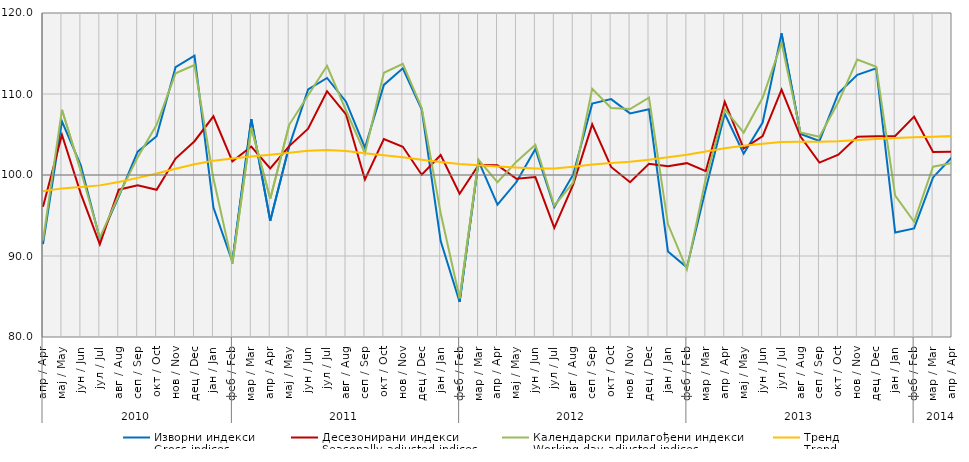
| Category | Изворни индекси
Gross indices | Десезонирани индекси
Seasonally adjusted indices | Календарски прилагођени индекси
Working-day adjusted indices | Тренд
Trend |
|---|---|---|---|---|
| 0 | 91.457 | 96.081 | 91.916 | 98.007 |
| 1 | 106.618 | 104.965 | 108.05 | 98.348 |
| 2 | 101.158 | 97.669 | 100.485 | 98.523 |
| 3 | 92.091 | 91.43 | 92.245 | 98.719 |
| 4 | 97.34 | 98.188 | 97.502 | 99.148 |
| 5 | 102.887 | 98.726 | 102.203 | 99.648 |
| 6 | 104.784 | 98.167 | 106.191 | 100.179 |
| 7 | 113.309 | 102.033 | 112.555 | 100.767 |
| 8 | 114.724 | 104.173 | 113.582 | 101.329 |
| 9 | 95.976 | 107.243 | 99.562 | 101.758 |
| 10 | 89.293 | 101.684 | 89.035 | 102.038 |
| 11 | 106.89 | 103.513 | 105.826 | 102.273 |
| 12 | 94.359 | 100.818 | 97.072 | 102.502 |
| 13 | 103.572 | 103.564 | 106.195 | 102.749 |
| 14 | 110.572 | 105.721 | 109.837 | 102.981 |
| 15 | 111.982 | 110.345 | 113.486 | 103.089 |
| 16 | 109.048 | 107.5 | 107.962 | 102.95 |
| 17 | 103.369 | 99.441 | 102.682 | 102.671 |
| 18 | 111.125 | 104.436 | 112.617 | 102.452 |
| 19 | 113.167 | 103.48 | 113.734 | 102.19 |
| 20 | 108.083 | 100.027 | 108.263 | 101.887 |
| 21 | 91.849 | 102.464 | 95.28 | 101.616 |
| 22 | 84.325 | 97.692 | 84.778 | 101.363 |
| 23 | 101.706 | 101.229 | 101.876 | 101.199 |
| 24 | 96.339 | 101.211 | 99.108 | 101.061 |
| 25 | 99.133 | 99.536 | 101.643 | 100.922 |
| 26 | 103.214 | 99.738 | 103.732 | 100.817 |
| 27 | 96.046 | 93.476 | 96.206 | 100.796 |
| 28 | 100.071 | 98.843 | 99.075 | 101.011 |
| 29 | 108.809 | 106.256 | 110.638 | 101.307 |
| 30 | 109.371 | 100.989 | 108.283 | 101.472 |
| 31 | 107.609 | 99.105 | 108.148 | 101.638 |
| 32 | 108.112 | 101.39 | 109.564 | 101.891 |
| 33 | 90.559 | 101.086 | 93.942 | 102.183 |
| 34 | 88.596 | 101.464 | 88.34 | 102.499 |
| 35 | 98.288 | 100.488 | 99.607 | 102.889 |
| 36 | 107.567 | 109.028 | 108.106 | 103.308 |
| 37 | 102.635 | 103.268 | 105.234 | 103.599 |
| 38 | 106.478 | 104.798 | 109.539 | 103.862 |
| 39 | 117.488 | 110.55 | 116.318 | 104.082 |
| 40 | 105.073 | 104.746 | 105.249 | 104.112 |
| 41 | 104.198 | 101.534 | 104.721 | 104.1 |
| 42 | 110.096 | 102.505 | 109 | 104.181 |
| 43 | 112.368 | 104.709 | 114.258 | 104.32 |
| 44 | 113.169 | 104.797 | 113.358 | 104.451 |
| 45 | 92.9 | 104.812 | 97.462 | 104.576 |
| 46 | 93.4 | 107.202 | 94.232 | 104.674 |
| 47 | 99.7 | 102.851 | 101.021 | 104.716 |
| 48 | 102.2 | 102.886 | 101.477 | 104.804 |